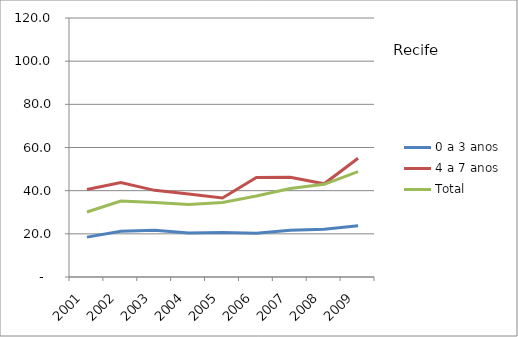
| Category | 0 a 3 anos | 4 a 7 anos | Total |
|---|---|---|---|
| 2001.0 | 18.48 | 40.52 | 30.1 |
| 2002.0 | 21.18 | 43.74 | 35.17 |
| 2003.0 | 21.7 | 40.14 | 34.47 |
| 2004.0 | 20.41 | 38.5 | 33.6 |
| 2005.0 | 20.56 | 36.63 | 34.53 |
| 2006.0 | 20.26 | 46.15 | 37.55 |
| 2007.0 | 21.61 | 46.23 | 40.98 |
| 2008.0 | 22.12 | 43.19 | 42.93 |
| 2009.0 | 23.77 | 55.04 | 48.82 |